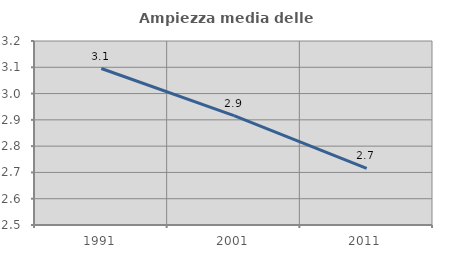
| Category | Ampiezza media delle famiglie |
|---|---|
| 1991.0 | 3.095 |
| 2001.0 | 2.916 |
| 2011.0 | 2.715 |